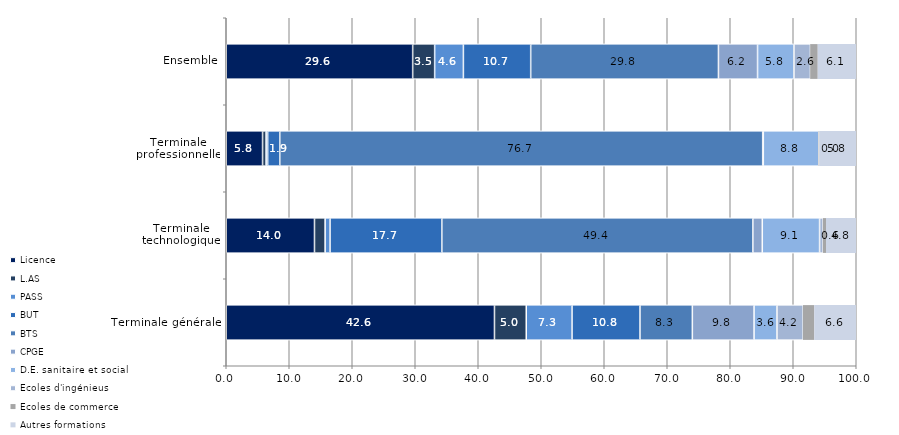
| Category | Licence | L.AS | PASS | BUT | BTS | CPGE | D.E. sanitaire et social | Ecoles d'ingénieus | Ecoles de commerce | Autres formations  |
|---|---|---|---|---|---|---|---|---|---|---|
| Terminale générale | 42.576 | 5.044 | 7.266 | 10.784 | 8.313 | 9.796 | 3.635 | 4.167 | 1.793 | 6.626 |
| Terminale technologique | 14.007 | 1.69 | 0.779 | 17.745 | 49.368 | 1.497 | 9.097 | 0.566 | 0.493 | 4.759 |
| Terminale professionnelle | 5.764 | 0.564 | 0.246 | 1.92 | 76.653 | 0.103 | 8.805 | 0.011 | 0.087 | 5.847 |
| Ensemble | 29.589 | 3.491 | 4.563 | 10.681 | 29.804 | 6.207 | 5.775 | 2.619 | 1.196 | 6.075 |